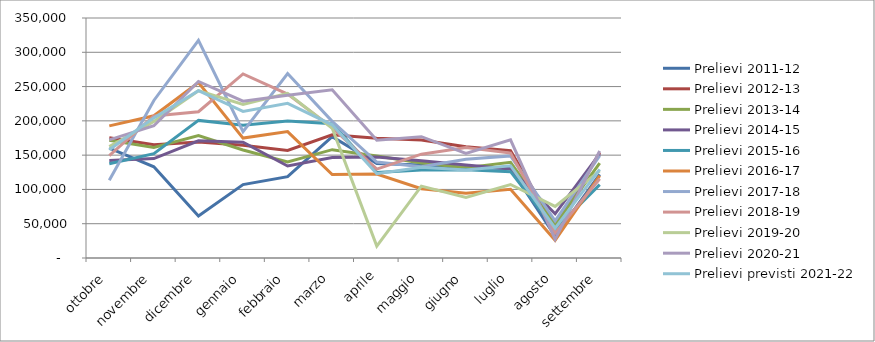
| Category | Prelievi 2011-12 | Prelievi 2012-13 | Prelievi 2013-14 | Prelievi 2014-15 | Prelievi 2015-16 | Prelievi 2016-17 | Prelievi 2017-18 | Prelievi 2018-19 | Prelievi 2019-20 | Prelievi 2020-21 | Prelievi previsti 2021-22 |
|---|---|---|---|---|---|---|---|---|---|---|---|
| ottobre | 160278 | 175365 | 171846 | 142176 | 137519 | 192661 | 113277 | 149282 | 162523 | 172222 | 157811 |
| novembre | 133059 | 165071 | 161193 | 145022 | 152198 | 207340 | 229723 | 207203 | 199050 | 192817 | 204383 |
| dicembre | 61261 | 169250 | 178609 | 170827 | 200683 | 255825 | 317288 | 213366 | 244005 | 257483 | 243932 |
| gennaio | 107041 | 164428 | 157575 | 168754 | 193728 | 174868 | 184241 | 268364 | 223828 | 228683 | 213746 |
| febbraio | 118619 | 156931 | 140152 | 134220 | 199628 | 184285 | 269035 | 239026 | 240244 | 237389 | 225626 |
| marzo | 176898 | 179709 | 157980 | 146435 | 195883 | 121800 | 199257 | 190188 | 189219 | 245286 | 194191 |
| aprile | 137699 | 174491 | 148902 | 147392 | 124575 | 122448 | 139841 | 129653 | 17332 | 171700 | 122842 |
| maggio | 135751 | 172131 | 138497 | 141722 | 128500 | 100939 | 133092 | 151422 | 104801 | 176942 | 132364 |
| giugno | 131959 | 162326 | 131579 | 135559 | 128636 | 94509 | 144090 | 161214 | 88213 | 152540 | 128200 |
| luglio | 130620 | 156602 | 139511 | 129899 | 125904 | 100343 | 148850 | 153065 | 107203 | 172173 | 134590 |
| agosto | 31927 | 45781 | 49020 | 64469 | 41930 | 25809 | 54242 | 36227 | 75282 | 27159 | 43442 |
| settembre | 121837 | 153970 | 138358 | 151937 | 107027 | 120083 | 149294 | 115475 | 127079 | 155973 | 129155 |